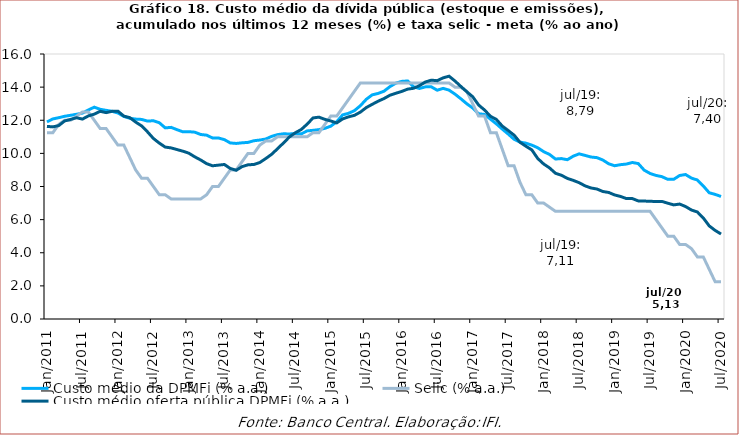
| Category | Custo médio da DPMFi (% a.a.) | Selic (% a.a.) | Custo médio oferta pública DPMFi (% a.a.) |
|---|---|---|---|
| 2011-01-31 | 11.9 | 11.25 | 11.63 |
| 2011-02-28 | 12.08 | 11.25 | 11.6 |
| 2011-03-31 | 12.155 | 11.75 | 11.68 |
| 2011-04-30 | 12.24 | 12 | 11.96 |
| 2011-05-31 | 12.3 | 12 | 12.05 |
| 2011-06-30 | 12.36 | 12.25 | 12.15 |
| 2011-07-31 | 12.43 | 12.5 | 12.07 |
| 2011-08-31 | 12.62 | 12.5 | 12.26 |
| 2011-09-30 | 12.79 | 12 | 12.37 |
| 2011-10-31 | 12.66 | 11.5 | 12.54 |
| 2011-11-30 | 12.6 | 11.5 | 12.46 |
| 2011-12-31 | 12.54 | 11 | 12.54 |
| 2012-01-31 | 12.44 | 10.5 | 12.55 |
| 2012-02-29 | 12.23 | 10.5 | 12.25 |
| 2012-03-31 | 12.12 | 9.75 | 12.16 |
| 2012-04-30 | 12.07 | 9 | 11.89 |
| 2012-05-31 | 12.05 | 8.5 | 11.66 |
| 2012-06-30 | 11.95 | 8.5 | 11.3 |
| 2012-07-31 | 11.97 | 8 | 10.9 |
| 2012-08-31 | 11.85 | 7.5 | 10.62 |
| 2012-09-30 | 11.54 | 7.5 | 10.38 |
| 2012-10-31 | 11.57 | 7.25 | 10.33 |
| 2012-11-30 | 11.43 | 7.25 | 10.23 |
| 2012-12-31 | 11.3 | 7.25 | 10.13 |
| 2013-01-31 | 11.31 | 7.25 | 10.01 |
| 2013-02-28 | 11.28 | 7.25 | 9.79 |
| 2013-03-31 | 11.14 | 7.25 | 9.6 |
| 2013-04-30 | 11.1 | 7.5 | 9.38 |
| 2013-05-31 | 10.93 | 8 | 9.25 |
| 2013-06-30 | 10.93 | 8 | 9.29 |
| 2013-07-31 | 10.83 | 8.5 | 9.33 |
| 2013-08-31 | 10.63 | 9 | 9.09 |
| 2013-09-30 | 10.6 | 9 | 8.98 |
| 2013-10-31 | 10.637 | 9.5 | 9.2 |
| 2013-11-30 | 10.663 | 10 | 9.31 |
| 2013-12-31 | 10.763 | 10 | 9.33 |
| 2014-01-31 | 10.805 | 10.5 | 9.449 |
| 2014-02-28 | 10.867 | 10.75 | 9.686 |
| 2014-03-31 | 11.027 | 10.75 | 9.946 |
| 2014-04-30 | 11.131 | 11 | 10.282 |
| 2014-05-31 | 11.182 | 11 | 10.629 |
| 2014-06-30 | 11.173 | 11 | 10.991 |
| 2014-07-31 | 11.197 | 11 | 11.246 |
| 2014-08-31 | 11.175 | 11 | 11.439 |
| 2014-09-30 | 11.356 | 11 | 11.764 |
| 2014-10-31 | 11.391 | 11.25 | 12.14 |
| 2014-11-30 | 11.435 | 11.25 | 12.187 |
| 2014-12-31 | 11.512 | 11.75 | 12.053 |
| 2015-01-31 | 11.643 | 12.25 | 11.956 |
| 2015-02-27 | 11.909 | 12.25 | 11.84 |
| 2015-03-31 | 12.323 | 12.75 | 12.08 |
| 2015-04-30 | 12.419 | 13.25 | 12.204 |
| 2015-05-31 | 12.579 | 13.75 | 12.297 |
| 2015-06-30 | 12.877 | 14.25 | 12.491 |
| 2015-07-31 | 13.263 | 14.25 | 12.765 |
| 2015-08-31 | 13.532 | 14.25 | 12.96 |
| 2015-09-30 | 13.618 | 14.25 | 13.15 |
| 2015-10-31 | 13.754 | 14.25 | 13.31 |
| 2015-11-30 | 14.029 | 14.25 | 13.51 |
| 2015-12-31 | 14.241 | 14.25 | 13.63 |
| 2016-01-31 | 14.346 | 14.25 | 13.74 |
| 2016-02-29 | 14.372 | 14.25 | 13.88 |
| 2016-03-31 | 14.015 | 14.25 | 13.93 |
| 2016-04-30 | 13.92 | 14.25 | 14.09 |
| 2016-05-31 | 14.016 | 14.25 | 14.31 |
| 2016-06-30 | 14.017 | 14.25 | 14.42 |
| 2016-07-31 | 13.814 | 14.25 | 14.39 |
| 2016-08-31 | 13.924 | 14.25 | 14.56 |
| 2016-09-30 | 13.82 | 14.25 | 14.66 |
| 2016-10-31 | 13.578 | 14 | 14.37 |
| 2016-11-30 | 13.296 | 14 | 14.04 |
| 2016-12-31 | 12.996 | 13.75 | 13.72 |
| 2017-01-31 | 12.739 | 13 | 13.42 |
| 2017-02-28 | 12.394 | 12.25 | 12.92 |
| 2017-03-31 | 12.351 | 12.25 | 12.62 |
| 2017-04-30 | 12.068 | 11.25 | 12.24 |
| 2017-05-31 | 11.784 | 11.25 | 12.05 |
| 2017-06-30 | 11.466 | 10.25 | 11.65 |
| 2017-07-31 | 11.168 | 9.25 | 11.38 |
| 2017-08-31 | 10.85 | 9.25 | 11.1 |
| 2017-09-30 | 10.68 | 8.25 | 10.67 |
| 2017-10-31 | 10.617 | 7.5 | 10.43 |
| 2017-11-30 | 10.498 | 7.5 | 10.21 |
| 2017-12-31 | 10.339 | 7 | 9.69 |
| 2018-01-31 | 10.104 | 7 | 9.36 |
| 2018-02-28 | 9.934 | 6.75 | 9.12 |
| 2018-03-31 | 9.659 | 6.5 | 8.8 |
| 2018-04-30 | 9.686 | 6.5 | 8.68 |
| 2018-05-31 | 9.617 | 6.5 | 8.49 |
| 2018-06-30 | 9.83 | 6.5 | 8.37 |
| 2018-07-31 | 9.971 | 6.5 | 8.23 |
| 2018-08-31 | 9.878 | 6.5 | 8.04 |
| 2018-09-30 | 9.78 | 6.5 | 7.91 |
| 2018-10-31 | 9.743 | 6.5 | 7.85 |
| 2018-11-30 | 9.6 | 6.5 | 7.7 |
| 2018-12-31 | 9.371 | 6.5 | 7.64 |
| 2019-01-31 | 9.254 | 6.5 | 7.49 |
| 2019-02-28 | 9.318 | 6.5 | 7.4 |
| 2019-03-31 | 9.355 | 6.5 | 7.27 |
| 2019-04-30 | 9.449 | 6.5 | 7.27 |
| 2019-05-31 | 9.385 | 6.5 | 7.13 |
| 2019-06-30 | 8.987 | 6.5 | 7.12 |
| 2019-07-31 | 8.788 | 6.5 | 7.11 |
| 2019-08-31 | 8.669 | 6 | 7.09 |
| 2019-09-30 | 8.594 | 5.5 | 7.1 |
| 2019-10-31 | 8.431 | 5 | 6.99 |
| 2019-11-30 | 8.435 | 5 | 6.89 |
| 2019-12-31 | 8.665 | 4.5 | 6.94 |
| 2020-01-31 | 8.723 | 4.5 | 6.79 |
| 2020-02-29 | 8.505 | 4.25 | 6.58 |
| 2020-03-31 | 8.392 | 3.75 | 6.46 |
| 2020-04-30 | 8.031 | 3.75 | 6.1 |
| 2020-05-31 | 7.621 | 3 | 5.62 |
| 2020-06-30 | 7.524 | 2.25 | 5.35 |
| 2020-07-31 | 7.398 | 2.25 | 5.13 |